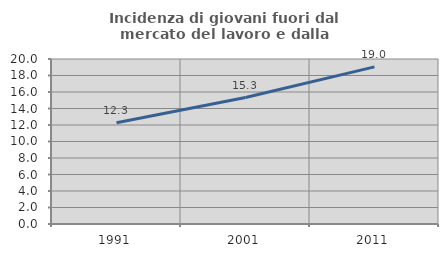
| Category | Incidenza di giovani fuori dal mercato del lavoro e dalla formazione  |
|---|---|
| 1991.0 | 12.264 |
| 2001.0 | 15.333 |
| 2011.0 | 19.048 |